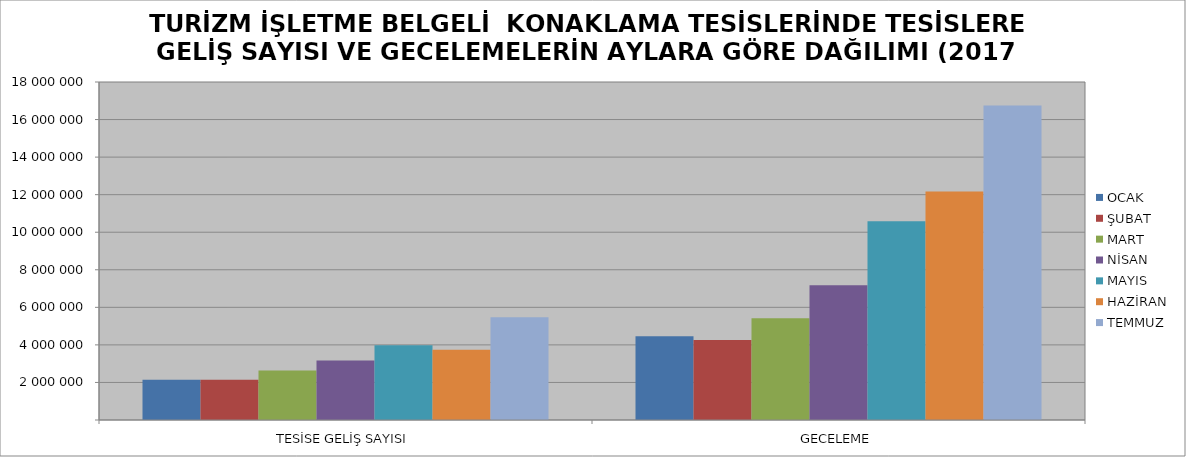
| Category | OCAK | ŞUBAT | MART | NİSAN | MAYIS | HAZİRAN | TEMMUZ |
|---|---|---|---|---|---|---|---|
| TESİSE GELİŞ SAYISI | 2146994 | 2141043 | 2629734 | 3173381 | 3978651 | 3742131 | 5470767 |
| GECELEME | 4457352 | 4260377 | 5413903 | 7176325 | 10579158 | 12172370 | 16748728 |